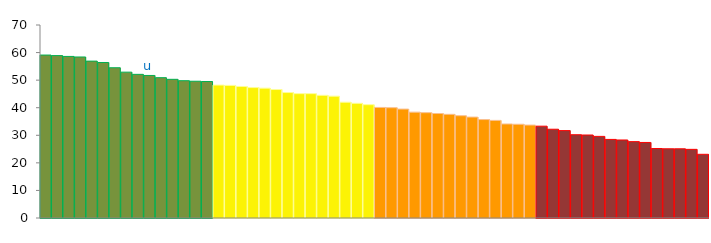
| Category | Top Quartile | 2nd Quartile | 3rd Quartile | Bottom Quartile | Series 4 |
|---|---|---|---|---|---|
|  | 59.1 | 0 | 0 | 0 | 59.1 |
|  | 58.9 | 0 | 0 | 0 | 58.9 |
|  | 58.6 | 0 | 0 | 0 | 58.6 |
|  | 58.4 | 0 | 0 | 0 | 58.4 |
|  | 56.9 | 0 | 0 | 0 | 56.9 |
|  | 56.4 | 0 | 0 | 0 | 56.4 |
|  | 54.5 | 0 | 0 | 0 | 54.5 |
|  | 52.9 | 0 | 0 | 0 | 52.9 |
|  | 52.1 | 0 | 0 | 0 | 52.1 |
| u | 51.7 | 0 | 0 | 0 | 51.7 |